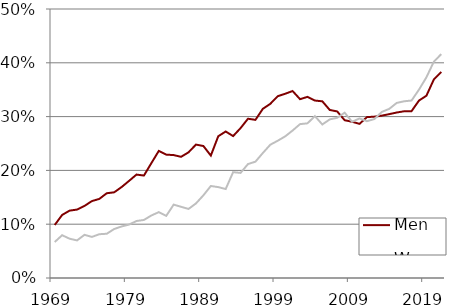
| Category | Men | Women |
|---|---|---|
| 1969.0 | 0.099 | 0.067 |
| 1970.0 | 0.117 | 0.08 |
| 1971.0 | 0.125 | 0.073 |
| 1972.0 | 0.127 | 0.07 |
| 1973.0 | 0.134 | 0.08 |
| 1974.0 | 0.143 | 0.076 |
| 1975.0 | 0.147 | 0.081 |
| 1976.0 | 0.158 | 0.082 |
| 1977.0 | 0.159 | 0.091 |
| 1978.0 | 0.169 | 0.096 |
| 1979.0 | 0.181 | 0.099 |
| 1980.0 | 0.192 | 0.106 |
| 1981.0 | 0.19 | 0.108 |
| 1982.0 | 0.213 | 0.116 |
| 1983.0 | 0.236 | 0.122 |
| 1984.0 | 0.229 | 0.115 |
| 1985.0 | 0.228 | 0.136 |
| 1986.0 | 0.225 | 0.132 |
| 1987.0 | 0.234 | 0.128 |
| 1988.0 | 0.248 | 0.139 |
| 1989.0 | 0.245 | 0.154 |
| 1990.0 | 0.228 | 0.171 |
| 1991.0 | 0.264 | 0.169 |
| 1992.0 | 0.272 | 0.165 |
| 1993.0 | 0.264 | 0.197 |
| 1994.0 | 0.279 | 0.195 |
| 1995.0 | 0.296 | 0.212 |
| 1996.0 | 0.294 | 0.216 |
| 1997.0 | 0.314 | 0.232 |
| 1998.0 | 0.324 | 0.248 |
| 1999.0 | 0.338 | 0.255 |
| 2000.0 | 0.342 | 0.263 |
| 2001.0 | 0.348 | 0.274 |
| 2002.0 | 0.332 | 0.286 |
| 2003.0 | 0.337 | 0.287 |
| 2004.0 | 0.33 | 0.301 |
| 2005.0 | 0.328 | 0.285 |
| 2006.0 | 0.312 | 0.295 |
| 2007.0 | 0.31 | 0.298 |
| 2008.0 | 0.293 | 0.307 |
| 2009.0 | 0.29 | 0.29 |
| 2010.0 | 0.287 | 0.297 |
| 2011.0 | 0.299 | 0.291 |
| 2012.0 | 0.3 | 0.295 |
| 2013.0 | 0.302 | 0.309 |
| 2014.0 | 0.305 | 0.314 |
| 2015.0 | 0.308 | 0.325 |
| 2016.0 | 0.31 | 0.328 |
| 2017.0 | 0.31 | 0.33 |
| 2018.0 | 0.33 | 0.35 |
| 2019.0 | 0.339 | 0.373 |
| 2020.0 | 0.369 | 0.402 |
| 2021.0 | 0.383 | 0.416 |